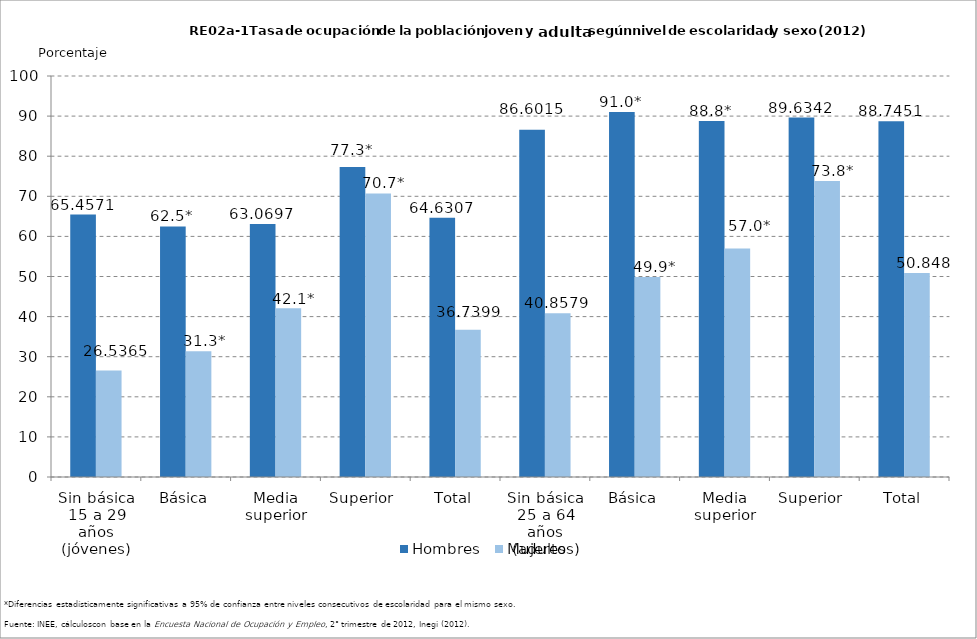
| Category | Hombres | Mujeres |
|---|---|---|
| 0 | 65.457 | 26.536 |
| 1 | 62.49 | 31.343 |
| 2 | 63.07 | 42.064 |
| 3 | 77.309 | 70.699 |
| 4 | 64.631 | 36.74 |
| 5 | 86.602 | 40.858 |
| 6 | 90.999 | 49.892 |
| 7 | 88.774 | 56.989 |
| 8 | 89.634 | 73.787 |
| 9 | 88.745 | 50.848 |